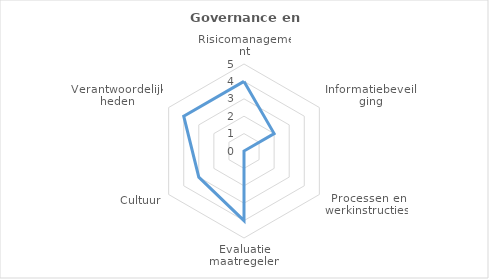
| Category | Series 0 |
|---|---|
| Risicomanagement | 4 |
| Informatiebeveiliging | 2 |
| Processen en werkinstructies | 0 |
| Evaluatie maatregelen | 4 |
| Cultuur | 3 |
| Verantwoordelijkheden | 4 |